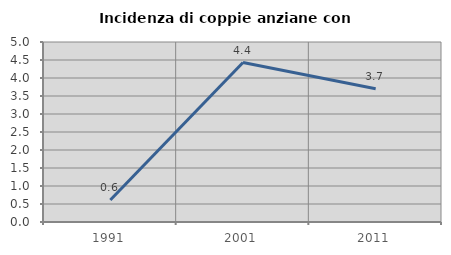
| Category | Incidenza di coppie anziane con figli |
|---|---|
| 1991.0 | 0.61 |
| 2001.0 | 4.43 |
| 2011.0 | 3.704 |